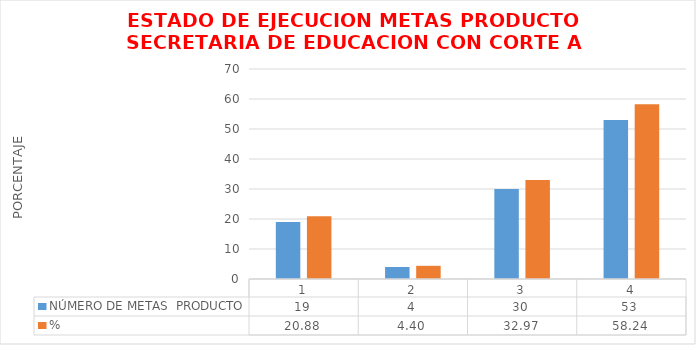
| Category | NÚMERO DE METAS  PRODUCTO  | % |
|---|---|---|
| 0 | 19 | 20.879 |
| 1 | 4 | 4.396 |
| 2 | 30 | 32.967 |
| 3 | 53 | 58.242 |